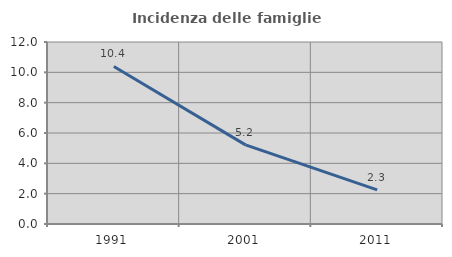
| Category | Incidenza delle famiglie numerose |
|---|---|
| 1991.0 | 10.385 |
| 2001.0 | 5.219 |
| 2011.0 | 2.251 |